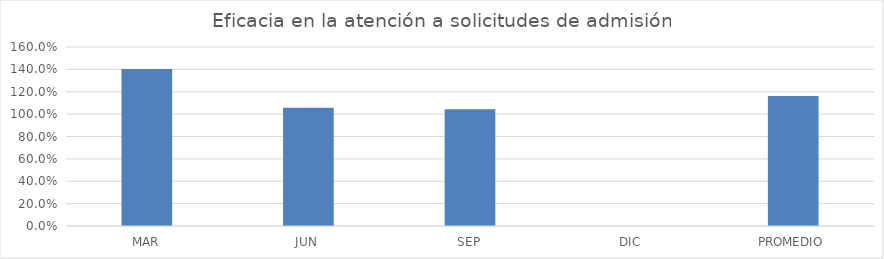
| Category | Series 0 |
|---|---|
| MAR | 1.402 |
| JUN | 1.056 |
| SEP | 1.044 |
| DIC | 0 |
| PROMEDIO | 1.161 |